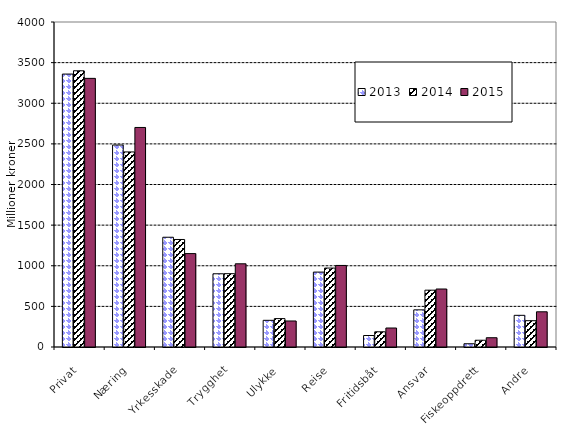
| Category | 2013 | 2014 | 2015 |
|---|---|---|---|
| Privat | 3359.064 | 3399.607 | 3306.181 |
| Næring | 2485.733 | 2400.952 | 2701.946 |
| Yrkesskade | 1350.935 | 1323.374 | 1149.454 |
| Trygghet | 901.239 | 902.33 | 1024.114 |
| Ulykke | 328.451 | 349.449 | 320.227 |
| Reise | 922 | 971.58 | 1003.721 |
| Fritidsbåt | 141.471 | 187.189 | 233.83 |
| Ansvar | 457.186 | 699.335 | 713.799 |
| Fiskeoppdrett | 40.037 | 83.202 | 114.061 |
| Andre | 389.969 | 323.662 | 433.39 |